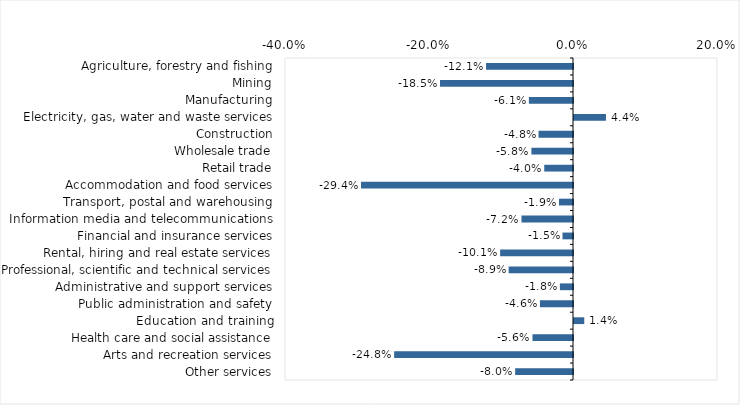
| Category | This week |
|---|---|
| Agriculture, forestry and fishing | -0.121 |
| Mining | -0.185 |
| Manufacturing | -0.061 |
| Electricity, gas, water and waste services | 0.044 |
| Construction | -0.048 |
| Wholesale trade | -0.058 |
| Retail trade | -0.04 |
| Accommodation and food services | -0.294 |
| Transport, postal and warehousing | -0.019 |
| Information media and telecommunications | -0.072 |
| Financial and insurance services | -0.015 |
| Rental, hiring and real estate services | -0.101 |
| Professional, scientific and technical services | -0.089 |
| Administrative and support services | -0.018 |
| Public administration and safety | -0.046 |
| Education and training | 0.014 |
| Health care and social assistance | -0.056 |
| Arts and recreation services | -0.248 |
| Other services | -0.08 |